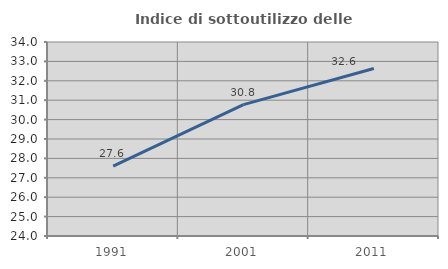
| Category | Indice di sottoutilizzo delle abitazioni  |
|---|---|
| 1991.0 | 27.597 |
| 2001.0 | 30.769 |
| 2011.0 | 32.637 |